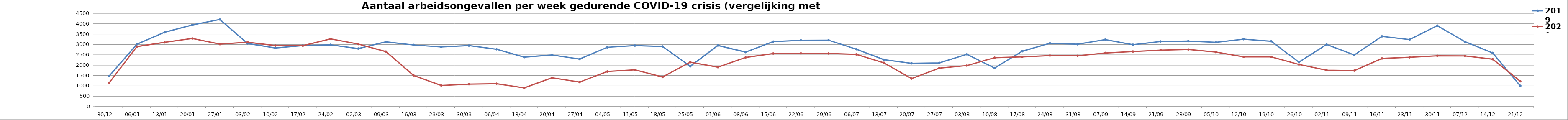
| Category | 2019 | 2020 |
|---|---|---|
| 30/12--- | 1477 | 1151 |
| 06/01--- | 3010 | 2897 |
| 13/01--- | 3587 | 3101 |
| 20/01--- | 3940 | 3288 |
| 27/01--- | 4205 | 3016 |
| 03/02--- | 3046 | 3108 |
| 10/02--- | 2831 | 2945 |
| 17/02--- | 2947 | 2941 |
| 24/02--- | 2982 | 3269 |
| 02/03--- | 2801 | 3020 |
| 09/03--- | 3125 | 2655 |
| 16/03--- | 2974 | 1506 |
| 23/03--- | 2883 | 1020 |
| 30/03--- | 2944 | 1083 |
| 06/04--- | 2770 | 1105 |
| 13/04--- | 2389 | 903 |
| 20/04--- | 2492 | 1391 |
| 27/04--- | 2296 | 1185 |
| 04/05--- | 2863 | 1694 |
| 11/05--- | 2946 | 1775 |
| 18/05--- | 2903 | 1431 |
| 25/05--- | 1946 | 2145 |
| 01/06--- | 2952 | 1905 |
| 08/06--- | 2632 | 2372 |
| 15/06--- | 3137 | 2563 |
| 22/06--- | 3197 | 2569 |
| 29/06--- | 3205 | 2567 |
| 06/07--- | 2773 | 2522 |
| 13/07--- | 2265 | 2112 |
| 20/07--- | 2091 | 1353 |
| 27/07--- | 2110 | 1855 |
| 03/08--- | 2526 | 1980 |
| 10/08--- | 1860 | 2363 |
| 17/08--- | 2674 | 2402 |
| 24/08--- | 3056 | 2464 |
| 31/08--- | 3011 | 2451 |
| 07/09--- | 3234 | 2590 |
| 14/09--- | 2986 | 2659 |
| 21/09--- | 3143 | 2726 |
| 28/09--- | 3162 | 2758 |
| 05/10--- | 3101 | 2632 |
| 12/10--- | 3256 | 2402 |
| 19/10--- | 3155 | 2402 |
| 26/10--- | 2147 | 2035 |
| 02/11--- | 3000 | 1755 |
| 09/11--- | 2494 | 1736 |
| 16/11--- | 3391 | 2325 |
| 23/11--- | 3236 | 2379 |
| 30/11--- | 3906 | 2452 |
| 07/12--- | 3133 | 2449 |
| 14/12--- | 2591 | 2291 |
| 21/12--- | 1004 | 1225 |